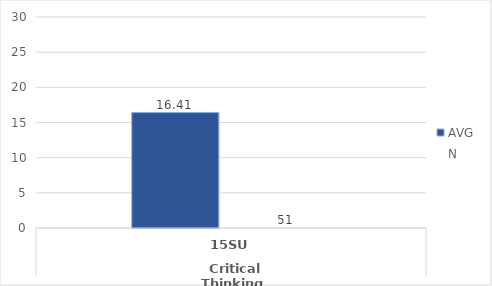
| Category | Mathematics - AVG | Mathematics - N |
|---|---|---|
| 0 | 16.412 | 51 |